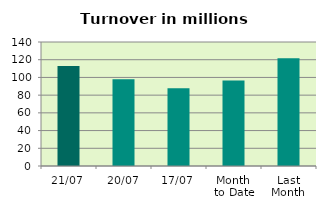
| Category | Series 0 |
|---|---|
| 21/07 | 112.998 |
| 20/07 | 97.982 |
| 17/07 | 87.906 |
| Month 
to Date | 96.487 |
| Last
Month | 121.74 |